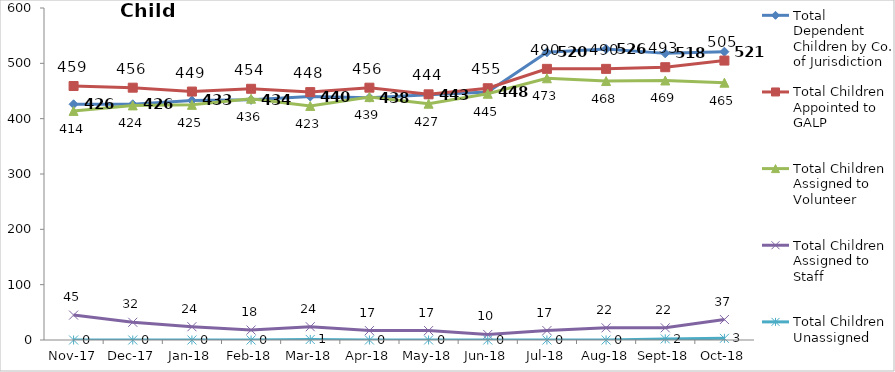
| Category | Total Dependent Children by Co. of Jurisdiction | Total Children Appointed to GALP | Total Children Assigned to Volunteer | Total Children Assigned to Staff | Total Children Unassigned |
|---|---|---|---|---|---|
| 2017-11-01 | 426 | 459 | 414 | 45 | 0 |
| 2017-12-01 | 426 | 456 | 424 | 32 | 0 |
| 2018-01-01 | 433 | 449 | 425 | 24 | 0 |
| 2018-02-01 | 434 | 454 | 436 | 18 | 0 |
| 2018-03-01 | 440 | 448 | 423 | 24 | 1 |
| 2018-04-01 | 438 | 456 | 439 | 17 | 0 |
| 2018-05-01 | 443 | 444 | 427 | 17 | 0 |
| 2018-06-01 | 448 | 455 | 445 | 10 | 0 |
| 2018-07-01 | 520 | 490 | 473 | 17 | 0 |
| 2018-08-01 | 526 | 490 | 468 | 22 | 0 |
| 2018-09-01 | 518 | 493 | 469 | 22 | 2 |
| 2018-10-01 | 521 | 505 | 465 | 37 | 3 |